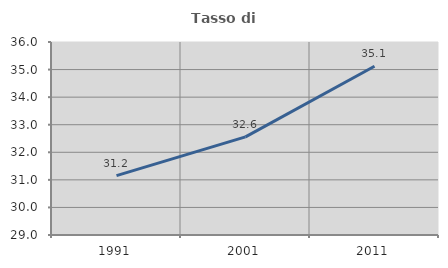
| Category | Tasso di occupazione   |
|---|---|
| 1991.0 | 31.155 |
| 2001.0 | 32.558 |
| 2011.0 | 35.12 |